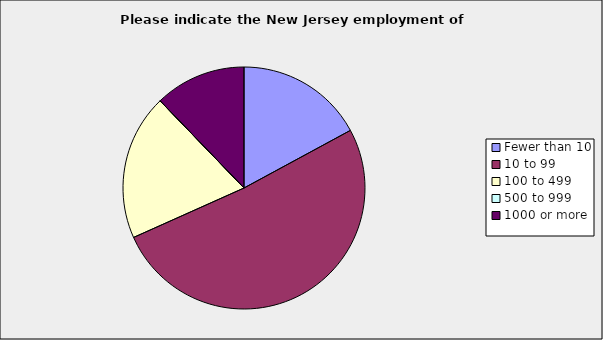
| Category | Series 0 |
|---|---|
| Fewer than 10 | 0.171 |
| 10 to 99 | 0.512 |
| 100 to 499 | 0.195 |
| 500 to 999 | 0 |
| 1000 or more | 0.122 |